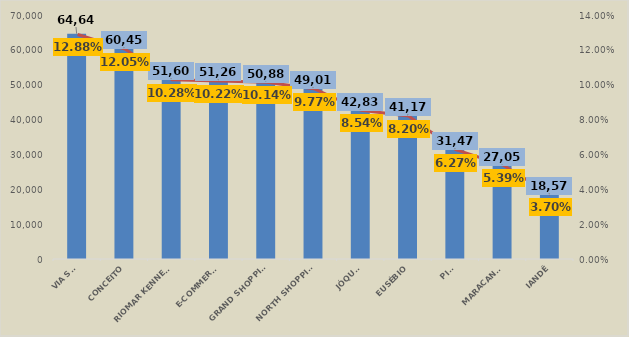
| Category | Em R$ 1 |
|---|---|
| VIA SUL | 64639.743 |
| CONCEITO | 60449.952 |
| RIOMAR KENNEDY | 51601.211 |
| E-COMMERCE | 51269.089 |
| GRAND SHOPPING | 50888.754 |
| NORTH SHOPPING | 49019.147 |
| JÓQUEI | 42829.978 |
| EUSÉBIO | 41171.792 |
| PICI | 31475.792 |
| MARACANAÚ | 27055.882 |
| IANDÊ | 18576.111 |